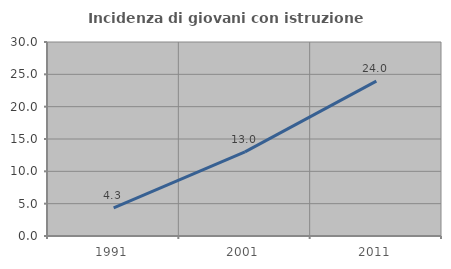
| Category | Incidenza di giovani con istruzione universitaria |
|---|---|
| 1991.0 | 4.348 |
| 2001.0 | 13.008 |
| 2011.0 | 23.958 |